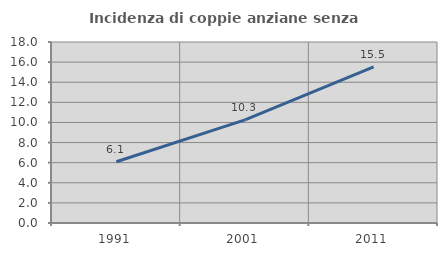
| Category | Incidenza di coppie anziane senza figli  |
|---|---|
| 1991.0 | 6.087 |
| 2001.0 | 10.256 |
| 2011.0 | 15.534 |